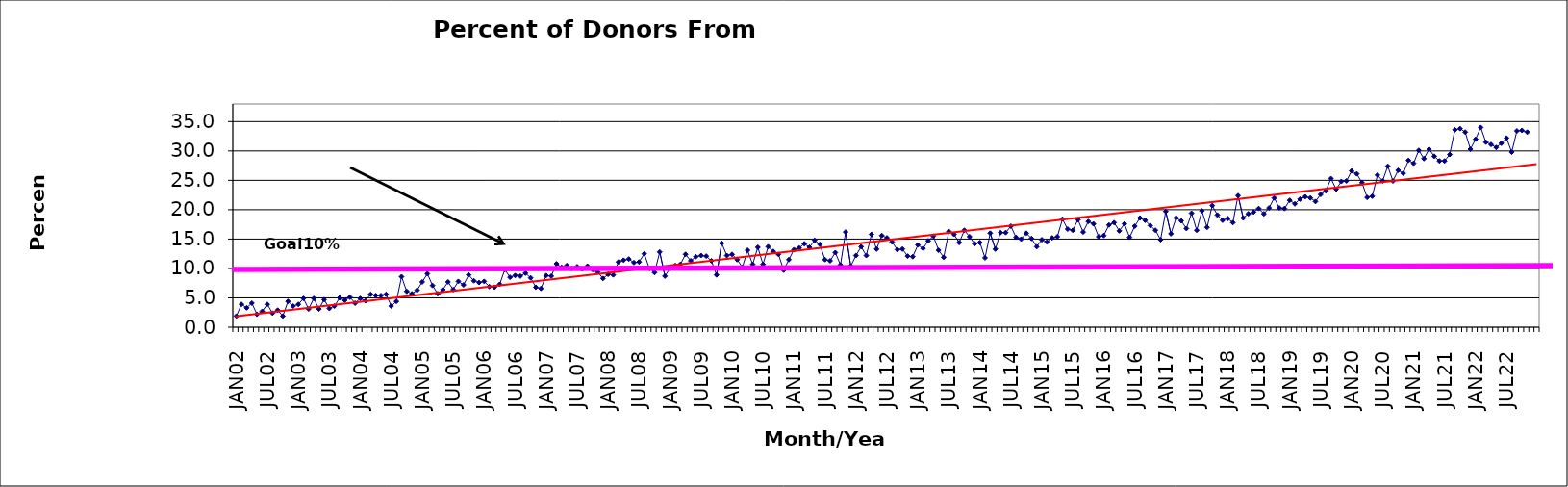
| Category | Series 0 |
|---|---|
| JAN02 | 1.9 |
| FEB02 | 3.9 |
| MAR02 | 3.3 |
| APR02 | 4.1 |
| MAY02 | 2.2 |
| JUN02 | 2.7 |
| JUL02 | 3.9 |
| AUG02 | 2.4 |
| SEP02 | 2.9 |
| OCT02 | 1.9 |
| NOV02 | 4.4 |
| DEC02 | 3.6 |
| JAN03 | 3.9 |
| FEB03 | 4.9 |
| MAR03 | 3.1 |
| APR03 | 4.9 |
| MAY03 | 3.1 |
| JUN03 | 4.7 |
| JUL03 | 3.2 |
| AUG03 | 3.6 |
| SEP03 | 5 |
| OCT03 | 4.6 |
| NOV03 | 5.1 |
| DEC03 | 4.1 |
| JAN04 | 4.9 |
| FEB04 | 4.5 |
| MAR04 | 5.6 |
| APR04 | 5.4 |
| MAY04 | 5.4 |
| JUN04 | 5.6 |
| JUL04 | 3.6 |
| AUG04 | 4.4 |
| SEP04 | 8.6 |
| OCT04 | 6.1 |
| NOV04 | 5.7 |
| DEC04 | 6.3 |
| JAN05 | 7.7 |
| FEB05 | 9.1 |
| MAR05 | 7.1 |
| APR05 | 5.7 |
| MAY05 | 6.4 |
| JUN05 | 7.7 |
| JUL05 | 6.4 |
| AUG05 | 7.8 |
| SEP05 | 7.2 |
| OCT05 | 8.9 |
| NOV05 | 7.9 |
| DEC05 | 7.6 |
| JAN06 | 7.8 |
| FEB06 | 6.9 |
| MAR06 | 6.8 |
| APR06 | 7.3 |
| MAY06 | 9.8 |
| JUN06 | 8.5 |
| JUL06 | 8.8 |
| AUG06 | 8.7 |
| SEP06 | 9.2 |
| OCT06 | 8.4 |
| NOV06 | 6.8 |
| DEC06 | 6.6 |
| JAN07 | 8.8 |
| FEB07 | 8.7 |
| MAR07 | 10.8 |
| APR07 | 10.2 |
| MAY07 | 10.5 |
| JUN07 | 10 |
| JUL07 | 10.3 |
| AUG07 | 9.9 |
| SEP07 | 10.4 |
| OCT07 | 9.8 |
| NOV07 | 9.4 |
| DEC07 | 8.3 |
| JAN08 | 9 |
| FEB08 | 8.9 |
| MAR08 | 11.1 |
| APR08 | 11.4 |
| MAY08 | 11.6 |
| JUN08 | 11 |
| JUL08 | 11.1 |
| AUG08 | 12.5 |
| SEP08 | 10 |
| OCT08 | 9.3 |
| NOV08 | 12.8 |
| DEC08 | 8.7 |
| JAN09 | 10 |
| FEB09 | 10.5 |
| MAR09 | 10.7 |
| APR09 | 12.4 |
| MAY09 | 11.3 |
| JUN09 | 12 |
| JUL09 | 12.2 |
| AUG09 | 12.1 |
| SEP09 | 11.3 |
| OCT09 | 8.9 |
| NOV09 | 14.3 |
| DEC09 | 12.2 |
| JAN10 | 12.4 |
| FEB10 | 11.5 |
| MAR10 | 10.2 |
| APR10 | 13.1 |
| MAY10 | 10.7 |
| JUN10 | 13.6 |
| JUL10 | 10.7 |
| AUG10 | 13.7 |
| SEP10 | 12.9 |
| OCT10 | 12.4 |
| NOV10 | 9.7 |
| DEC10 | 11.5 |
| JAN11 | 13.2 |
| FEB11 | 13.5 |
| MAR11 | 14.2 |
| APR11 | 13.6 |
| MAY11 | 14.8 |
| JUN11 | 14.1 |
| JUL11 | 11.5 |
| AUG11 | 11.3 |
| SEP11 | 12.7 |
| OCT11 | 10.6 |
| NOV11 | 16.2 |
| DEC11 | 10.4 |
| JAN12 | 12.2 |
| FEB12 | 13.7 |
| MAR12 | 12.2 |
| APR12 | 15.8 |
| MAY12 | 13.3 |
| JUN12 | 15.6 |
| JUL12 | 15.2 |
| AUG12 | 14.5 |
| SEP12 | 13.2 |
| OCT12 | 13.3 |
| NOV12 | 12.1 |
| DEC12 | 12 |
| JAN13 | 14 |
| FEB13 | 13.4 |
| MAR13 | 14.7 |
| APR13 | 15.5 |
| MAY13 | 13.1 |
| JUN13 | 11.9 |
| JUL13 | 16.3 |
| AUG13 | 15.8 |
| SEP13 | 14.4 |
| OCT13 | 16.5 |
| NOV13 | 15.4 |
| DEC13 | 14.2 |
| JAN14 | 14.4 |
| FEB14 | 11.8 |
| MAR14 | 16 |
| APR14 | 13.3 |
| MAY14 | 16.1 |
| JUN14 | 16.1 |
| JUL14 | 17.2 |
| AUG14 | 15.3 |
| SEP14 | 15 |
| OCT14 | 16 |
| NOV14 | 15.1 |
| DEC14 | 13.7 |
| JAN15 | 14.9 |
| FEB15 | 14.5 |
| MAR15 | 15.2 |
| APR15 | 15.4 |
| MAY15 | 18.4 |
| JUN15 | 16.7 |
| JUL15 | 16.5 |
| AUG15 | 18.3 |
| SEP15 | 16.2 |
| OCT15 | 18 |
| NOV15 | 17.6 |
| DEC15 | 15.4 |
| JAN16 | 15.6 |
| FEB16 | 17.4 |
| MAR16 | 17.8 |
| APR16 | 16.4 |
| MAY16 | 17.6 |
| JUN16 | 15.3 |
| JUL16 | 17.2 |
| AUG16 | 18.6 |
| SEP16 | 18.2 |
| OCT16 | 17.3 |
| NOV16 | 16.5 |
| DEC16 | 14.9 |
| JAN17 | 19.7 |
| FEB17 | 15.9 |
| MAR17 | 18.6 |
| APR17 | 18.1 |
| MAY17 | 16.8 |
| JUN17 | 19.4 |
| JUL17 | 16.5 |
| AUG17 | 19.8 |
| SEP17 | 17 |
| OCT17 | 20.7 |
| NOV17 | 19.1 |
| DEC17 | 18.2 |
| JAN18 | 18.5 |
| FEB18 | 17.8 |
| MAR18 | 22.4 |
| APR18 | 18.6 |
| MAY18 | 19.3 |
| JUN18 | 19.6 |
| JUL18 | 20.2 |
| AUG18 | 19.3 |
| SEP18 | 20.3 |
| OCT18 | 22 |
| NOV18 | 20.3 |
| DEC18 | 20.2 |
| JAN19 | 21.6 |
| FEB19 | 21 |
| MAR19 | 21.8 |
| APR19 | 22.2 |
| MAY19 | 22 |
| JUN19 | 21.4 |
| JUL19 | 22.6 |
| AUG19 | 23.2 |
| SEP19 | 25.3 |
| OCT19 | 23.5 |
| NOV19 | 24.8 |
| DEC19 | 24.9 |
| JAN20 | 26.6 |
| FEB20 | 26.1 |
| MAR20 | 24.6 |
| APR20 | 22.1 |
| MAY20 | 22.3 |
| JUN20 | 25.9 |
| JUL20 | 24.9 |
| AUG20 | 27.4 |
| SEP20 | 24.9 |
| OCT20 | 26.7 |
| NOV20 | 26.2 |
| DEC20 | 28.4 |
| JAN21 | 27.9 |
| FEB21 | 30.1 |
| MAR21 | 28.7 |
| APR21 | 30.3 |
| MAY21 | 29.1 |
| JUN21 | 28.3 |
| JUL21 | 28.3 |
| AUG21 | 29.4 |
| SEP21 | 33.6 |
| OCT21 | 33.8 |
| NOV21 | 33.2 |
| DEC21 | 30.3 |
| JAN22 | 32 |
| FEB22 | 34 |
| MAR22 | 31.5 |
| APR22 | 31.1 |
| MAY22 | 30.6 |
| JUN22 | 31.3 |
| JUL22 | 32.2 |
| AUG22 | 29.8 |
| SEP22 | 33.4 |
| OCT22 | 33.5 |
| NOV22 | 33.2 |